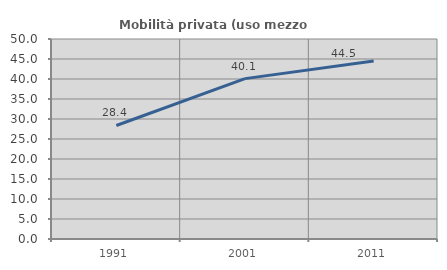
| Category | Mobilità privata (uso mezzo privato) |
|---|---|
| 1991.0 | 28.376 |
| 2001.0 | 40.097 |
| 2011.0 | 44.513 |